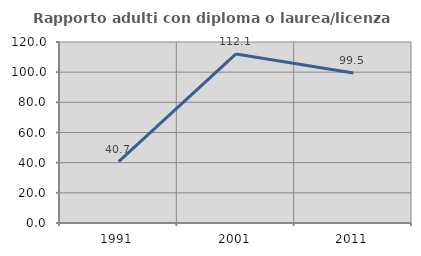
| Category | Rapporto adulti con diploma o laurea/licenza media  |
|---|---|
| 1991.0 | 40.667 |
| 2001.0 | 112.102 |
| 2011.0 | 99.495 |